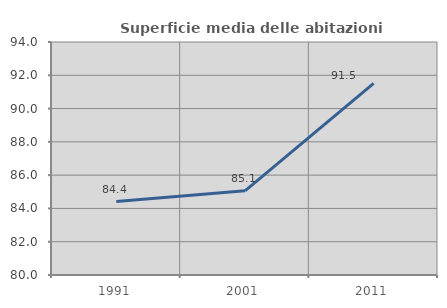
| Category | Superficie media delle abitazioni occupate |
|---|---|
| 1991.0 | 84.415 |
| 2001.0 | 85.061 |
| 2011.0 | 91.517 |